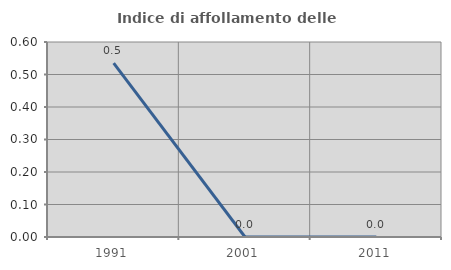
| Category | Indice di affollamento delle abitazioni  |
|---|---|
| 1991.0 | 0.535 |
| 2001.0 | 0 |
| 2011.0 | 0 |